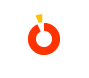
| Category | Series 0 |
|---|---|
| 0 | 30.709 |
| 1 | 2.191 |